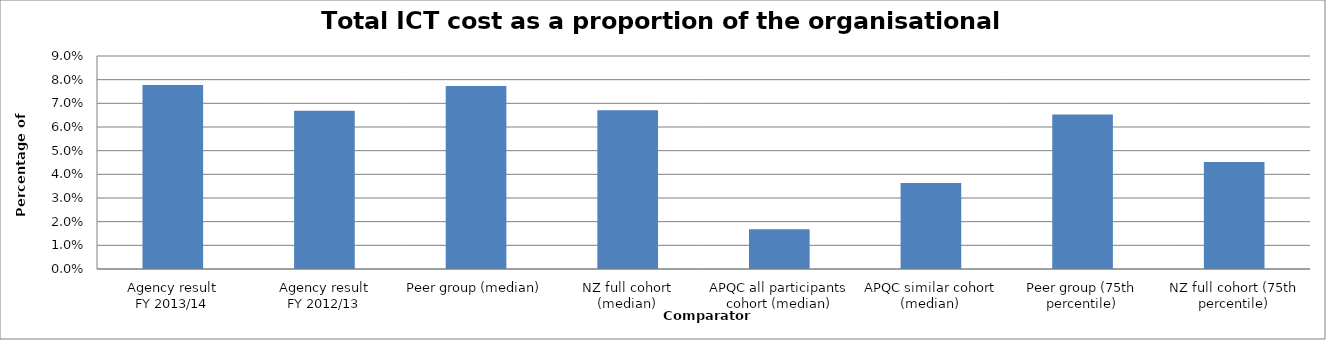
| Category | Result |
|---|---|
| Agency result
FY 2013/14 | 0.078 |
| Agency result
FY 2012/13 | 0.067 |
| Peer group (median) | 0.077 |
| NZ full cohort (median) | 0.067 |
| APQC all participants cohort (median) | 0.017 |
| APQC similar cohort (median) | 0.036 |
| Peer group (75th percentile) | 0.065 |
| NZ full cohort (75th percentile) | 0.045 |